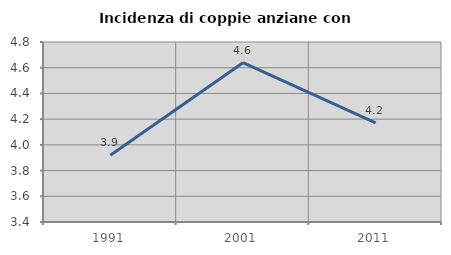
| Category | Incidenza di coppie anziane con figli |
|---|---|
| 1991.0 | 3.918 |
| 2001.0 | 4.639 |
| 2011.0 | 4.171 |